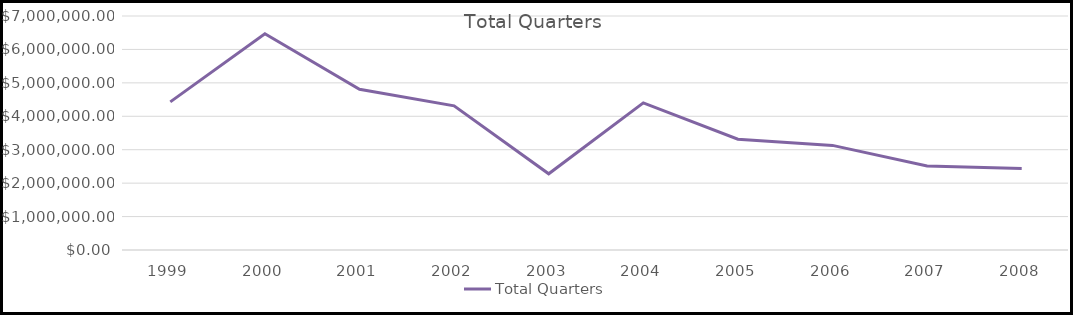
| Category | Total Quarters |
|---|---|
| 1999.0 | 4430940 |
| 2000.0 | 6470932 |
| 2001.0 | 4806984 |
| 2002.0 | 4313704 |
| 2003.0 | 2280400 |
| 2004.0 | 4401600 |
| 2005.0 | 3313600 |
| 2006.0 | 3128800 |
| 2007.0 | 2512440 |
| 2008.0 | 2438200 |